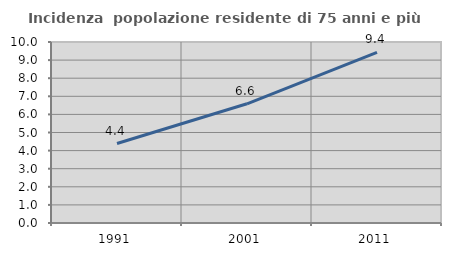
| Category | Incidenza  popolazione residente di 75 anni e più |
|---|---|
| 1991.0 | 4.392 |
| 2001.0 | 6.586 |
| 2011.0 | 9.424 |